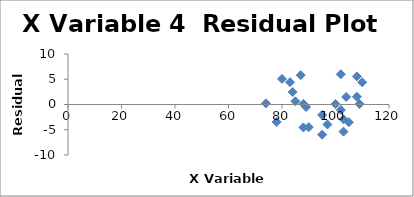
| Category | Series 0 |
|---|---|
| 87.0 | 5.812 |
| 100.0 | 0.086 |
| 103.0 | -5.375 |
| 95.0 | -5.978 |
| 88.0 | 0.117 |
| 84.0 | 2.475 |
| 74.0 | 0.229 |
| 102.0 | -1.079 |
| 105.0 | -3.504 |
| 97.0 | -3.956 |
| 88.0 | -4.543 |
| 108.0 | 1.536 |
| 89.0 | -0.504 |
| 78.0 | -3.451 |
| 109.0 | 0.094 |
| 108.0 | 5.565 |
| 102.0 | 5.996 |
| 110.0 | 4.402 |
| 95.0 | -2.067 |
| 90.0 | -4.499 |
| 85.0 | 0.624 |
| 103.0 | -2.939 |
| 80.0 | 5.057 |
| 104.0 | 1.488 |
| 83.0 | 4.414 |